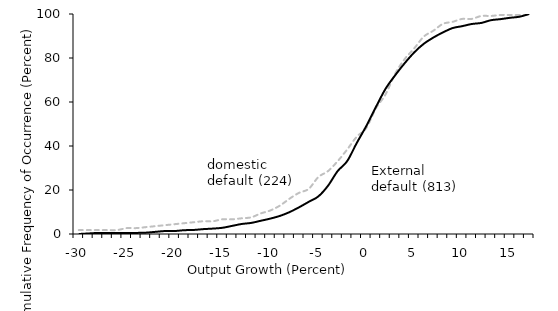
| Category | Series 1 | Series 0 |
|---|---|---|
| -30 | 1.786 | 0 |
| -29 | 1.786 | 0.246 |
| -28 | 1.786 | 0.492 |
| -27 | 1.786 | 0.492 |
| -26 | 1.786 | 0.492 |
| -25 | 2.679 | 0.492 |
| -24 | 2.679 | 0.492 |
| -23 | 3.125 | 0.615 |
| -22 | 3.571 | 0.984 |
| -21 | 4.018 | 1.353 |
| -20 | 4.464 | 1.353 |
| -19 | 4.911 | 1.722 |
| -18 | 5.357 | 1.845 |
| -17 | 5.804 | 2.214 |
| -16 | 5.804 | 2.46 |
| -15 | 6.696 | 2.829 |
| -14 | 6.696 | 3.69 |
| -13 | 7.143 | 4.551 |
| -12 | 7.589 | 5.043 |
| -11 | 9.375 | 6.027 |
| -10 | 10.714 | 7.011 |
| -9 | 12.946 | 8.241 |
| -8 | 16.071 | 9.963 |
| -7 | 18.75 | 12.177 |
| -6 | 20.536 | 14.637 |
| -5 | 25.893 | 17.097 |
| -4 | 28.571 | 21.894 |
| -3 | 33.036 | 28.536 |
| -2 | 38.393 | 33.087 |
| -1 | 44.196 | 41.328 |
| 0 | 48.214 | 49.077 |
| 1 | 57.143 | 57.688 |
| 2 | 63.393 | 65.929 |
| 3 | 72.768 | 72.079 |
| 4 | 79.464 | 77.614 |
| 5 | 84.375 | 82.534 |
| 6 | 89.732 | 86.47 |
| 7 | 92.411 | 89.299 |
| 8 | 95.536 | 91.636 |
| 9 | 96.429 | 93.604 |
| 10 | 97.768 | 94.465 |
| 11 | 97.768 | 95.449 |
| 12 | 99.107 | 95.941 |
| 13 | 99.107 | 97.171 |
| 14 | 99.554 | 97.663 |
| 15 | 99.554 | 98.278 |
| 16 | 99.554 | 98.77 |
| 16+ | 100 | 100 |